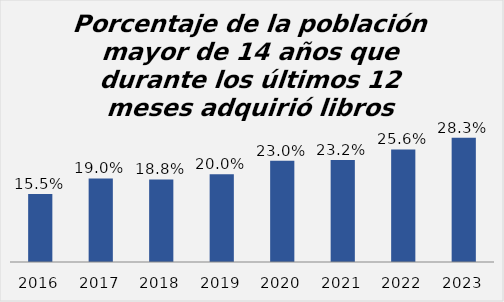
| Category | Series 0 |
|---|---|
| 2016.0 | 0.155 |
| 2017.0 | 0.19 |
| 2018.0 | 0.188 |
| 2019.0 | 0.2 |
| 2020.0 | 0.23 |
| 2021.0 | 0.232 |
| 2022.0 | 0.256 |
| 2023.0 | 0.283 |